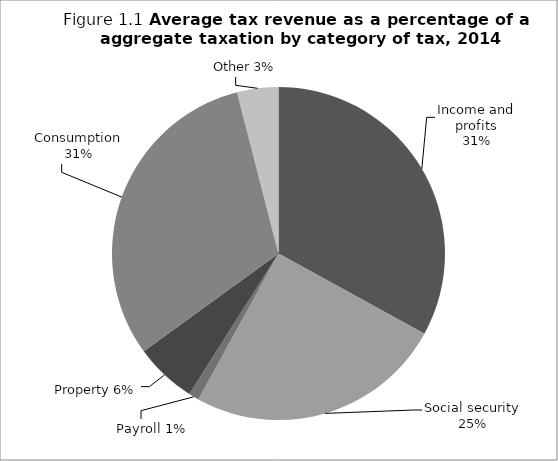
| Category | Series 0 |
|---|---|
| Income and profits | 33 |
| Social security | 25 |
| Payroll | 1 |
| Property | 6 |
| Consumption | 31 |
| Other | 4 |